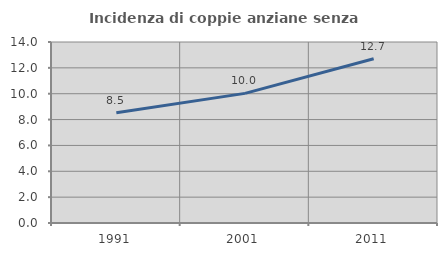
| Category | Incidenza di coppie anziane senza figli  |
|---|---|
| 1991.0 | 8.533 |
| 2001.0 | 10.025 |
| 2011.0 | 12.699 |